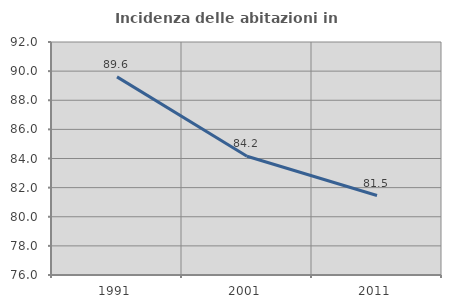
| Category | Incidenza delle abitazioni in proprietà  |
|---|---|
| 1991.0 | 89.607 |
| 2001.0 | 84.153 |
| 2011.0 | 81.459 |